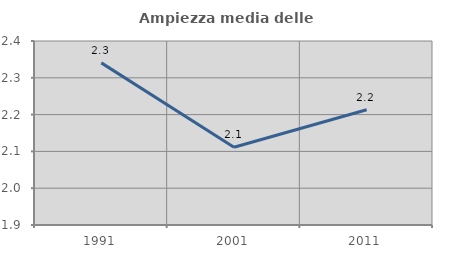
| Category | Ampiezza media delle famiglie |
|---|---|
| 1991.0 | 2.341 |
| 2001.0 | 2.111 |
| 2011.0 | 2.213 |